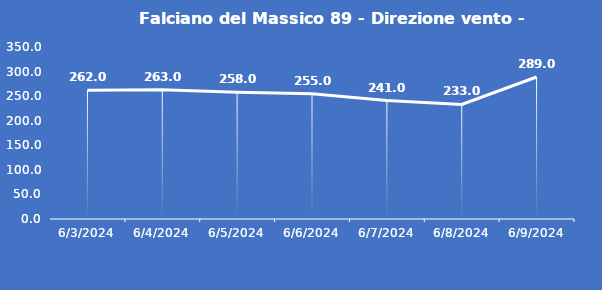
| Category | Falciano del Massico 89 - Direzione vento - Grezzo (°N) |
|---|---|
| 6/3/24 | 262 |
| 6/4/24 | 263 |
| 6/5/24 | 258 |
| 6/6/24 | 255 |
| 6/7/24 | 241 |
| 6/8/24 | 233 |
| 6/9/24 | 289 |